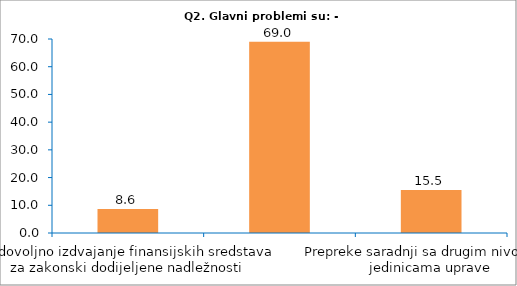
| Category | Series 0 |
|---|---|
| Nedovoljno izdvajanje finansijskih sredstava za zakonski dodijeljene nadležnosti | 8.621 |
| Zastarjeli sistem raspodjele javnih prihoda sa lokalnim vlastima | 68.966 |
| Prepreke saradnji sa drugim nivoima i jedinicama uprave | 15.517 |